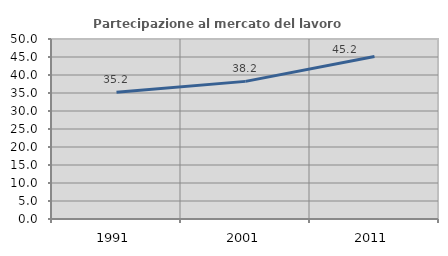
| Category | Partecipazione al mercato del lavoro  femminile |
|---|---|
| 1991.0 | 35.207 |
| 2001.0 | 38.229 |
| 2011.0 | 45.156 |